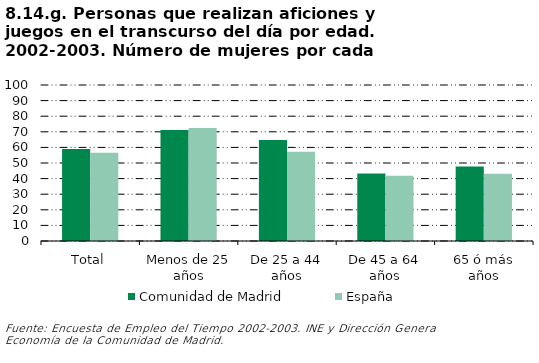
| Category | Comunidad de Madrid | España |
|---|---|---|
| Total | 58.921 | 56.522 |
| Menos de 25 años | 71.209 | 72.383 |
| De 25 a 44 años | 64.74 | 57.143 |
| De 45 a 64 años | 43.258 | 41.772 |
| 65 ó más años | 47.826 | 43.158 |